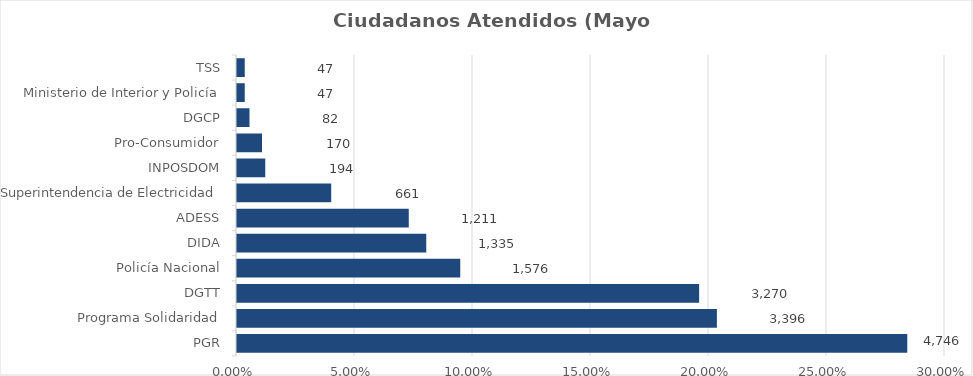
| Category | Porcentaje |
|---|---|
| PGR | 0.284 |
| Programa Solidaridad | 0.203 |
| DGTT | 0.195 |
| Policía Nacional | 0.094 |
| DIDA | 0.08 |
| ADESS | 0.072 |
| Superintendencia de Electricidad | 0.039 |
| INPOSDOM | 0.012 |
| Pro-Consumidor | 0.01 |
| DGCP | 0.005 |
| Ministerio de Interior y Policía | 0.003 |
| TSS | 0.003 |